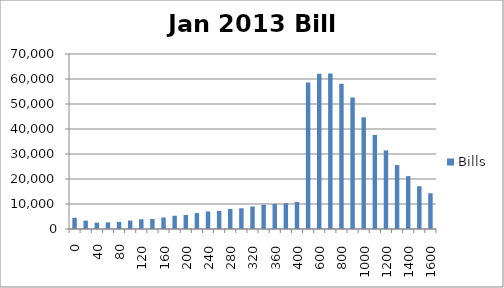
| Category | Bills |
|---|---|
| 0.0 | 4486.65 |
| 20.0 | 3343.322 |
| 40.0 | 2528.908 |
| 60.0 | 2661.67 |
| 80.0 | 2834.666 |
| 100.0 | 3373.112 |
| 120.0 | 3881.908 |
| 140.0 | 4005.586 |
| 160.0 | 4605.338 |
| 180.0 | 5293.765 |
| 200.0 | 5609.21 |
| 220.0 | 6348.563 |
| 240.0 | 7012.483 |
| 260.0 | 7267.61 |
| 280.0 | 8040.488 |
| 300.0 | 8299.741 |
| 320.0 | 8998.302 |
| 340.0 | 9695.018 |
| 360.0 | 10036.909 |
| 380.0 | 10291.569 |
| 400.0 | 10801.725 |
| 500.0 | 58646.844 |
| 600.0 | 62114.399 |
| 700.0 | 62216.436 |
| 800.0 | 58140.617 |
| 900.0 | 52593.472 |
| 1000.0 | 44678.427 |
| 1100.0 | 37617.888 |
| 1200.0 | 31438.328 |
| 1300.0 | 25550.388 |
| 1400.0 | 21159.846 |
| 1500.0 | 17121.796 |
| 1600.0 | 14292.968 |